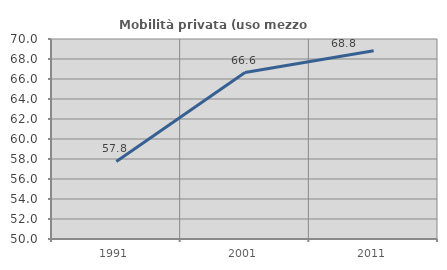
| Category | Mobilità privata (uso mezzo privato) |
|---|---|
| 1991.0 | 57.759 |
| 2001.0 | 66.645 |
| 2011.0 | 68.834 |